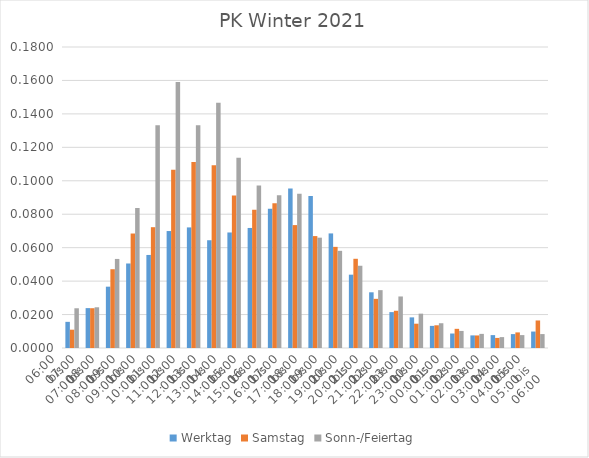
| Category | Werktag | Samstag | Sonn-/Feiertag |
|---|---|---|---|
| 06:00
bis
07:00 | 0.016 | 0.011 | 0.024 |
| 07:00
bis
08:00 | 0.024 | 0.024 | 0.024 |
| 08:00
bis
09:00 | 0.037 | 0.047 | 0.053 |
| 09:00
bis
10:00 | 0.051 | 0.068 | 0.084 |
| 10:00
bis
11:00 | 0.056 | 0.072 | 0.133 |
| 11:00
bis
12:00 | 0.07 | 0.107 | 0.159 |
| 12:00
bis
13:00 | 0.072 | 0.111 | 0.133 |
| 13:00
bis
14:00 | 0.064 | 0.109 | 0.147 |
| 14:00
bis
15:00 | 0.069 | 0.091 | 0.114 |
| 15:00
bis
16:00 | 0.072 | 0.083 | 0.097 |
| 16:00
bis
17:00 | 0.083 | 0.086 | 0.091 |
| 17:00
bis
18:00 | 0.095 | 0.073 | 0.092 |
| 18:00
bis
19:00 | 0.091 | 0.067 | 0.066 |
| 19:00
bis
20:00 | 0.069 | 0.06 | 0.058 |
| 20:00
bis
21:00 | 0.044 | 0.053 | 0.049 |
| 21:00
bis
22:00 | 0.033 | 0.029 | 0.035 |
| 22:00
bis
23:00 | 0.021 | 0.022 | 0.031 |
| 23:00
bis
00:00 | 0.018 | 0.015 | 0.021 |
| 00:00
bis
01:00 | 0.013 | 0.014 | 0.015 |
| 01:00
bis
02:00 | 0.009 | 0.011 | 0.01 |
| 02:00
bis
03:00 | 0.008 | 0.008 | 0.008 |
| 03:00
bis
04:00 | 0.008 | 0.006 | 0.007 |
| 04:00
bis
05:00 | 0.008 | 0.009 | 0.008 |
| 05:00
bis
06:00 | 0.01 | 0.016 | 0.008 |